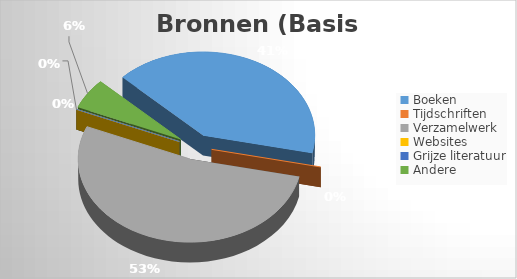
| Category | Series 0 | Series 1 |
|---|---|---|
| Boeken | 7 | 0.412 |
| Tijdschriften  | 0 | 0 |
| Verzamelwerk | 9 | 0.529 |
| Websites | 0 | 0 |
| Grijze literatuur | 0 | 0 |
| Andere | 1 | 0.059 |